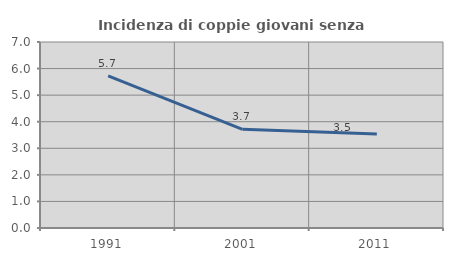
| Category | Incidenza di coppie giovani senza figli |
|---|---|
| 1991.0 | 5.723 |
| 2001.0 | 3.715 |
| 2011.0 | 3.537 |